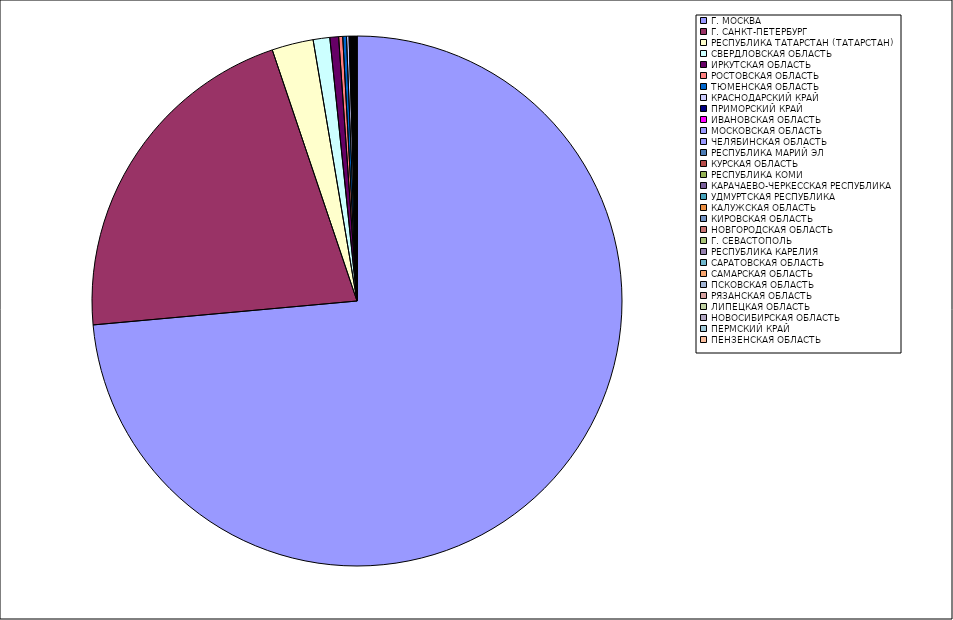
| Category | Оборот |
|---|---|
| Г. МОСКВА | 73.522 |
| Г. САНКТ-ПЕТЕРБУРГ | 21.248 |
| РЕСПУБЛИКА ТАТАРСТАН (ТАТАРСТАН) | 2.528 |
| СВЕРДЛОВСКАЯ ОБЛАСТЬ | 1.012 |
| ИРКУТСКАЯ ОБЛАСТЬ | 0.532 |
| РОСТОВСКАЯ ОБЛАСТЬ | 0.247 |
| ТЮМЕНСКАЯ ОБЛАСТЬ | 0.225 |
| КРАСНОДАРСКИЙ КРАЙ | 0.158 |
| ПРИМОРСКИЙ КРАЙ | 0.048 |
| ИВАНОВСКАЯ ОБЛАСТЬ | 0.042 |
| МОСКОВСКАЯ ОБЛАСТЬ | 0.036 |
| ЧЕЛЯБИНСКАЯ ОБЛАСТЬ | 0.033 |
| РЕСПУБЛИКА МАРИЙ ЭЛ | 0.032 |
| КУРСКАЯ ОБЛАСТЬ | 0.028 |
| РЕСПУБЛИКА КОМИ | 0.028 |
| КАРАЧАЕВО-ЧЕРКЕССКАЯ РЕСПУБЛИКА | 0.026 |
| УДМУРТСКАЯ РЕСПУБЛИКА | 0.023 |
| КАЛУЖСКАЯ ОБЛАСТЬ | 0.023 |
| КИРОВСКАЯ ОБЛАСТЬ | 0.019 |
| НОВГОРОДСКАЯ ОБЛАСТЬ | 0.018 |
| Г. СЕВАСТОПОЛЬ | 0.015 |
| РЕСПУБЛИКА КАРЕЛИЯ | 0.014 |
| САРАТОВСКАЯ ОБЛАСТЬ | 0.014 |
| САМАРСКАЯ ОБЛАСТЬ | 0.012 |
| ПСКОВСКАЯ ОБЛАСТЬ | 0.012 |
| РЯЗАНСКАЯ ОБЛАСТЬ | 0.011 |
| ЛИПЕЦКАЯ ОБЛАСТЬ | 0.011 |
| НОВОСИБИРСКАЯ ОБЛАСТЬ | 0.011 |
| ПЕРМСКИЙ КРАЙ | 0.01 |
| ПЕНЗЕНСКАЯ ОБЛАСТЬ | 0.01 |